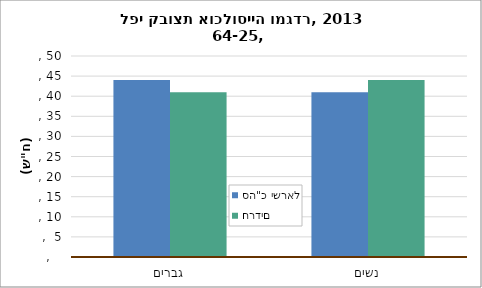
| Category | סה"כ ישראל | חרדים |
|---|---|---|
| גברים | 44 | 41 |
| נשים | 41 | 44 |